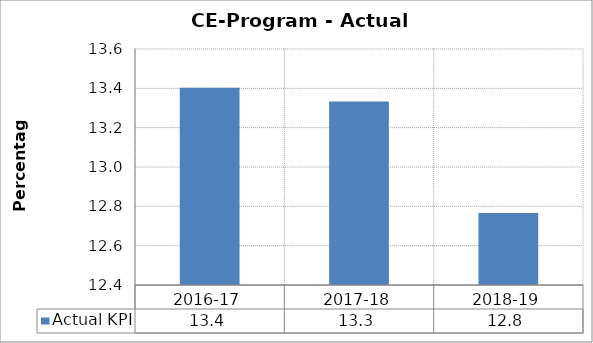
| Category | Actual KPI |
|---|---|
| 2016-17 | 13.402 |
| 2017-18 | 13.333 |
| 2018-19 | 12.767 |